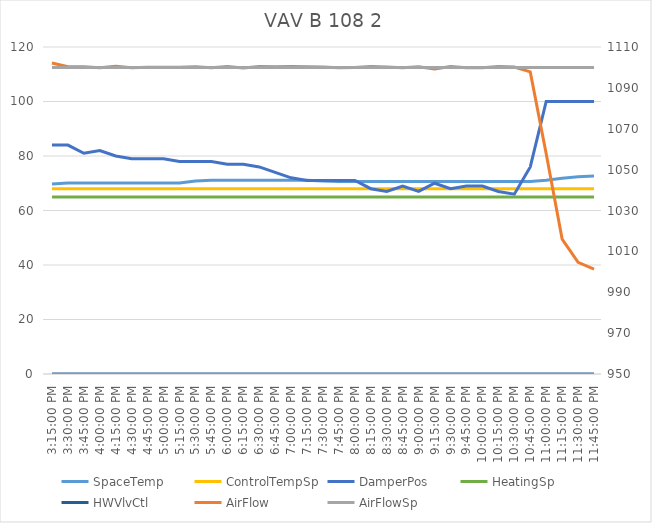
| Category | SpaceTemp | ControlTempSp | DamperPos | HeatingSp | HWVlvCtl |
|---|---|---|---|---|---|
| 2019-09-07 15:15:00 | 69.7 | 68 | 84 | 65 | 0 |
| 2019-09-07 15:30:00 | 70.1 | 68 | 84 | 65 | 0 |
| 2019-09-07 15:45:00 | 70.1 | 68 | 81 | 65 | 0 |
| 2019-09-07 16:00:00 | 70.1 | 68 | 82 | 65 | 0 |
| 2019-09-07 16:15:00 | 70.1 | 68 | 80 | 65 | 0 |
| 2019-09-07 16:30:00 | 70.1 | 68 | 79 | 65 | 0 |
| 2019-09-07 16:45:00 | 70.1 | 68 | 79 | 65 | 0 |
| 2019-09-07 17:00:00 | 70.1 | 68 | 79 | 65 | 0 |
| 2019-09-07 17:15:00 | 70.1 | 68 | 78 | 65 | 0 |
| 2019-09-07 17:30:00 | 70.8 | 68 | 78 | 65 | 0 |
| 2019-09-07 17:45:00 | 71.1 | 68 | 78 | 65 | 0 |
| 2019-09-07 18:00:00 | 71.1 | 68 | 77 | 65 | 0 |
| 2019-09-07 18:15:00 | 71.1 | 68 | 77 | 65 | 0 |
| 2019-09-07 18:30:00 | 71.1 | 68 | 76 | 65 | 0 |
| 2019-09-07 18:45:00 | 71.1 | 68 | 74 | 65 | 0 |
| 2019-09-07 19:00:00 | 71.1 | 68 | 72 | 65 | 0 |
| 2019-09-07 19:15:00 | 71.1 | 68 | 71 | 65 | 0 |
| 2019-09-07 19:30:00 | 70.8 | 68 | 71 | 65 | 0 |
| 2019-09-07 19:45:00 | 70.6 | 68 | 71 | 65 | 0 |
| 2019-09-07 20:00:00 | 70.6 | 68 | 71 | 65 | 0 |
| 2019-09-07 20:15:00 | 70.6 | 68 | 68 | 65 | 0 |
| 2019-09-07 20:30:00 | 70.6 | 68 | 67 | 65 | 0 |
| 2019-09-07 20:45:00 | 70.6 | 68 | 69 | 65 | 0 |
| 2019-09-07 21:00:00 | 70.6 | 68 | 67 | 65 | 0 |
| 2019-09-07 21:15:00 | 70.6 | 68 | 70 | 65 | 0 |
| 2019-09-07 21:30:00 | 70.6 | 68 | 68 | 65 | 0 |
| 2019-09-07 21:45:00 | 70.6 | 68 | 69 | 65 | 0 |
| 2019-09-07 22:00:00 | 70.6 | 68 | 69 | 65 | 0 |
| 2019-09-07 22:15:00 | 70.6 | 68 | 67 | 65 | 0 |
| 2019-09-07 22:30:00 | 70.6 | 68 | 66 | 65 | 0 |
| 2019-09-07 22:45:00 | 70.6 | 68 | 76 | 65 | 0 |
| 2019-09-07 23:00:00 | 71.1 | 68 | 100 | 65 | 0 |
| 2019-09-07 23:15:00 | 71.8 | 68 | 100 | 65 | 0 |
| 2019-09-07 23:30:00 | 72.4 | 68 | 100 | 65 | 0 |
| 2019-09-07 23:45:00 | 72.7 | 68 | 100 | 65 | 0 |